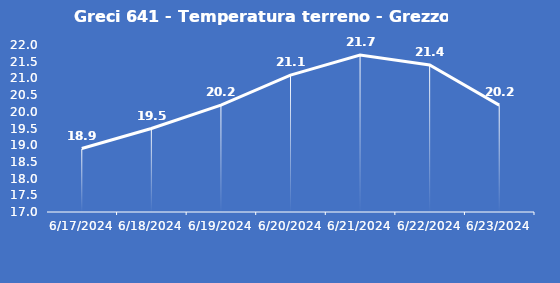
| Category | Greci 641 - Temperatura terreno - Grezzo (°C) |
|---|---|
| 6/17/24 | 18.9 |
| 6/18/24 | 19.5 |
| 6/19/24 | 20.2 |
| 6/20/24 | 21.1 |
| 6/21/24 | 21.7 |
| 6/22/24 | 21.4 |
| 6/23/24 | 20.2 |